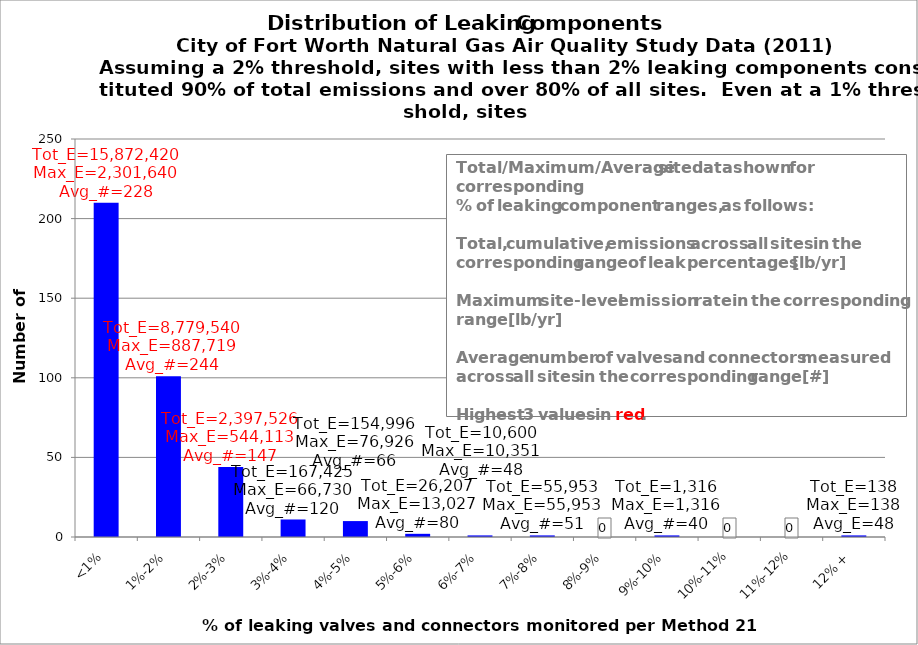
| Category | Series 0 |
|---|---|
| <1% | 210 |
| 1%-2% | 101 |
| 2%-3% | 44 |
| 3%-4% | 11 |
| 4%-5% | 10 |
| 5%-6% | 2 |
| 6%-7% | 1 |
| 7%-8% | 1 |
| 8%-9% | 0 |
| 9%-10% | 1 |
| 10%-11% | 0 |
| 11%-12% | 0 |
| 12% + | 1 |